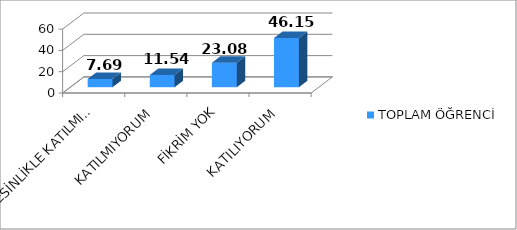
| Category | TOPLAM ÖĞRENCİ |
|---|---|
| KESİNLİKLE KATILMIYORUM | 7.69 |
| KATILMIYORUM | 11.54 |
| FİKRİM YOK | 23.08 |
| KATILIYORUM | 46.15 |